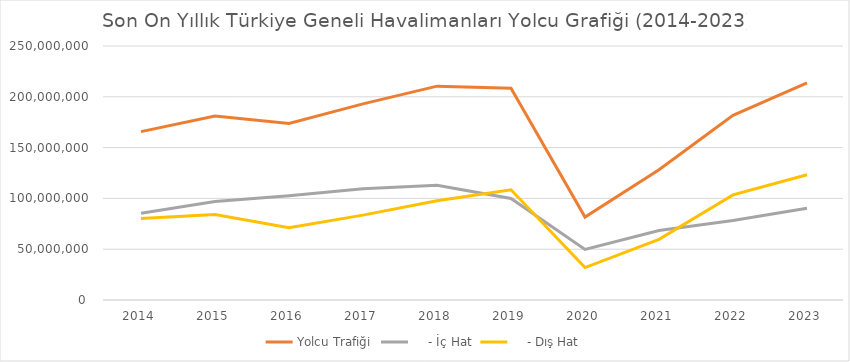
| Category | Yolcu Trafiği |     - İç Hat |     - Dış Hat |
|---|---|---|---|
| 2014.0 | 165720234 | 85416166 | 80304068 |
| 2015.0 | 181074531 | 97041210 | 84033321 |
| 2016.0 | 173743537 | 102499358 | 71244179 |
| 2017.0 | 193045343 | 109511390 | 83533953 |
| 2018.0 | 210498164 | 112911108 | 97587056 |
| 2019.0 | 208373696 | 99946572 | 108427124 |
| 2020.0 | 81616140 | 49740303 | 31875837 |
| 2021.0 | 128155762 | 68466177 | 59689585 |
| 2022.0 | 181789339 | 78323824 | 103465515 |
| 2023.0 | 213693163 | 90390766 | 123302397 |